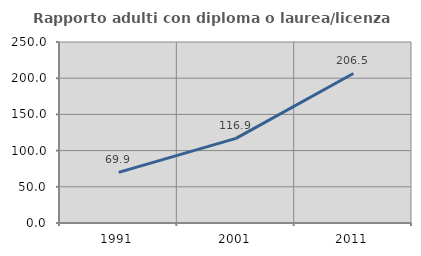
| Category | Rapporto adulti con diploma o laurea/licenza media  |
|---|---|
| 1991.0 | 69.863 |
| 2001.0 | 116.867 |
| 2011.0 | 206.494 |